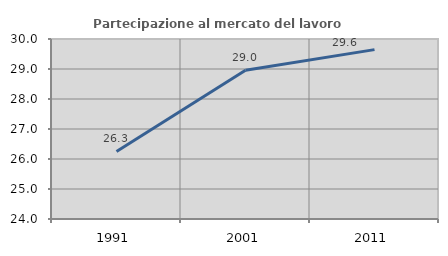
| Category | Partecipazione al mercato del lavoro  femminile |
|---|---|
| 1991.0 | 26.252 |
| 2001.0 | 28.96 |
| 2011.0 | 29.646 |